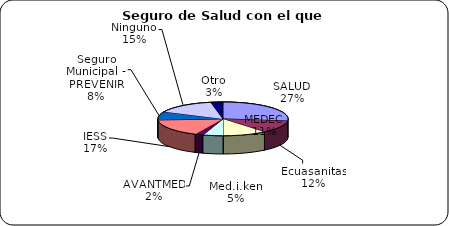
| Category | Series 0 |
|---|---|
| SALUD | 0.27 |
| Ecuasanitas | 0.12 |
| MEDEC | 0.11 |
| Med.i.ken | 0.05 |
| AVANTMED | 0.02 |
| IESS | 0.17 |
| Seguro Municipal - PREVENIR | 0.08 |
| Ninguno | 0.15 |
| Otro | 0.03 |